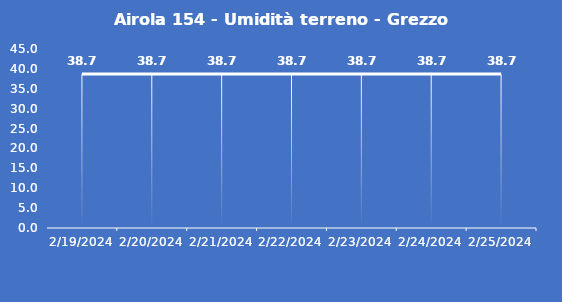
| Category | Airola 154 - Umidità terreno - Grezzo (%VWC) |
|---|---|
| 2/19/24 | 38.7 |
| 2/20/24 | 38.7 |
| 2/21/24 | 38.7 |
| 2/22/24 | 38.7 |
| 2/23/24 | 38.7 |
| 2/24/24 | 38.7 |
| 2/25/24 | 38.7 |